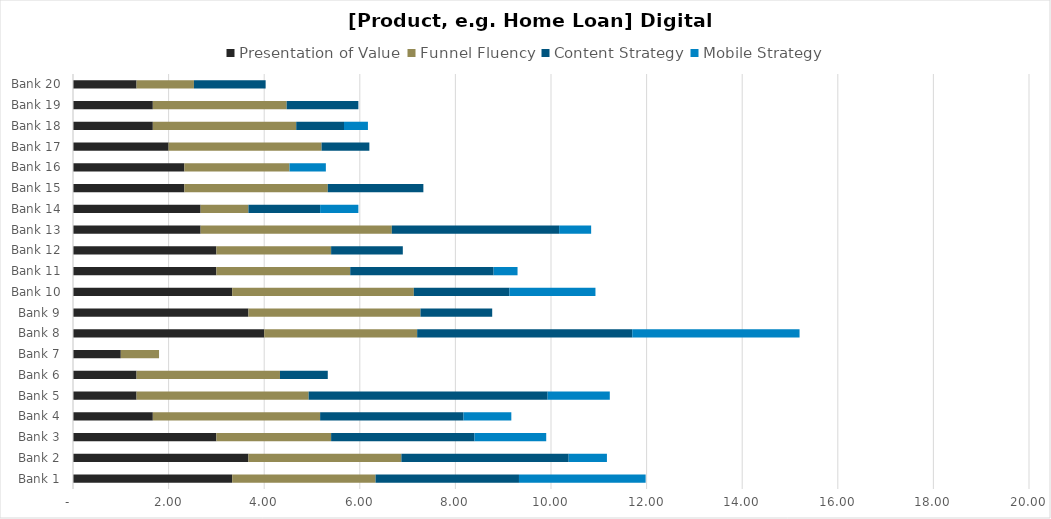
| Category | Presentation of Value | Funnel Fluency | Content Strategy | Mobile Strategy |
|---|---|---|---|---|
| Bank 1 | 3.33 | 3 | 3 | 2.65 |
| Bank 2 | 3.67 | 3.2 | 3.5 | 0.8 |
| Bank 3 | 3 | 2.4 | 3 | 1.5 |
| Bank 4 | 1.67 | 3.5 | 3 | 1 |
| Bank 5 | 1.33 | 3.6 | 5 | 1.3 |
| Bank 6 | 1.33 | 3 | 1 | 0 |
| Bank 7 | 1 | 0.8 | 0 | 0 |
| Bank 8 | 4 | 3.2 | 4.5 | 3.5 |
| Bank 9 | 3.67 | 3.6 | 1.5 | 0 |
| Bank 10 | 3.33 | 3.8 | 2 | 1.8 |
| Bank 11 | 3 | 2.8 | 3 | 0.5 |
| Bank 12 | 3 | 2.4 | 1.5 | 0 |
| Bank 13 | 2.67 | 4 | 3.5 | 0.67 |
| Bank 14 | 2.67 | 1 | 1.5 | 0.8 |
| Bank 15 | 2.33 | 3 | 2 | 0 |
| Bank 16 | 2.33 | 2.2 | 0 | 0.76 |
| Bank 17 | 2 | 3.2 | 1 | 0 |
| Bank 18 | 1.67 | 3 | 1 | 0.5 |
| Bank 19 | 1.67 | 2.8 | 1.5 | 0 |
| Bank 20 | 1.33 | 1.2 | 1.5 | 0 |